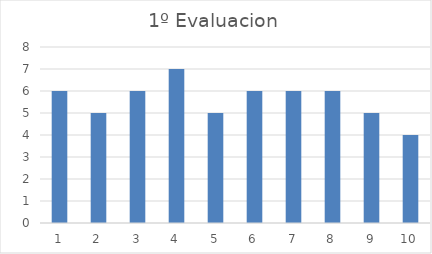
| Category | Series 0 |
|---|---|
| 0 | 6 |
| 1 | 5 |
| 2 | 6 |
| 3 | 7 |
| 4 | 5 |
| 5 | 6 |
| 6 | 6 |
| 7 | 6 |
| 8 | 5 |
| 9 | 4 |